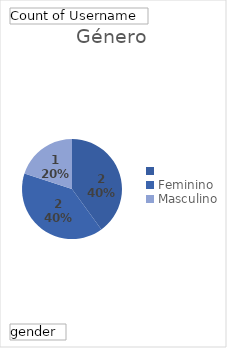
| Category | Total |
|---|---|
|  | 2 |
| Feminino | 2 |
| Masculino | 1 |